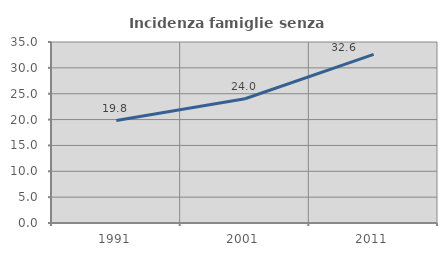
| Category | Incidenza famiglie senza nuclei |
|---|---|
| 1991.0 | 19.811 |
| 2001.0 | 24.026 |
| 2011.0 | 32.604 |